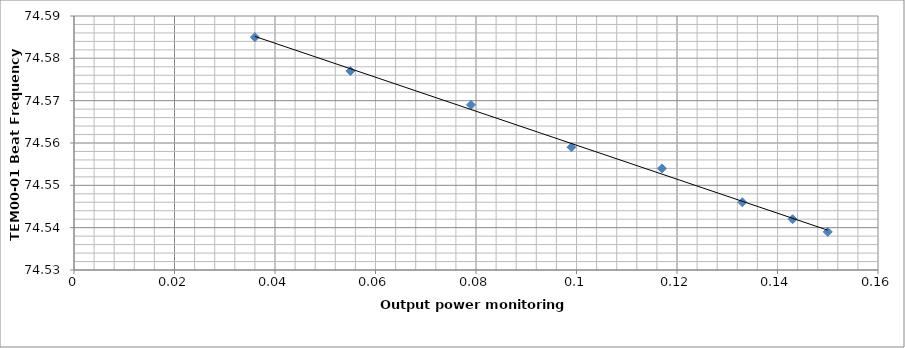
| Category | Series 0 |
|---|---|
| 0.15 | 74.539 |
| 0.143 | 74.542 |
| 0.133 | 74.546 |
| 0.117 | 74.554 |
| 0.099 | 74.559 |
| 0.079 | 74.569 |
| 0.055 | 74.577 |
| 0.036 | 74.585 |